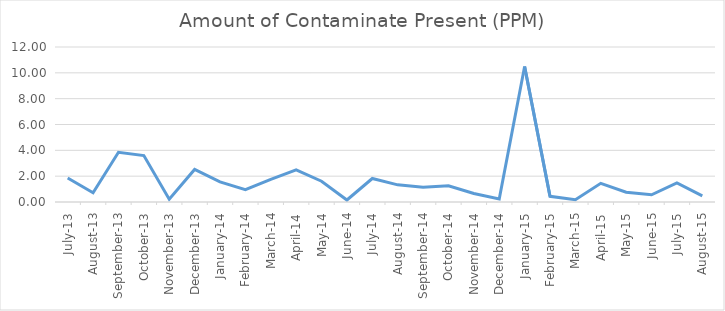
| Category | Amount of Contaminate Present (PPM) |
|---|---|
| 2013-07-01 | 1.863 |
| 2013-08-01 | 0.718 |
| 2013-09-01 | 3.85 |
| 2013-10-01 | 3.598 |
| 2013-11-01 | 0.216 |
| 2013-12-01 | 2.518 |
| 2014-01-01 | 1.553 |
| 2014-02-01 | 0.957 |
| 2014-03-01 | 1.755 |
| 2014-04-01 | 2.49 |
| 2014-05-01 | 1.609 |
| 2014-06-01 | 0.156 |
| 2014-07-01 | 1.821 |
| 2014-08-01 | 1.328 |
| 2014-09-01 | 1.147 |
| 2014-10-01 | 1.249 |
| 2014-11-01 | 0.654 |
| 2014-12-01 | 0.23 |
| 2015-01-01 | 10.496 |
| 2015-02-01 | 0.44 |
| 2015-03-01 | 0.18 |
| 2015-04-01 | 1.445 |
| 2015-05-01 | 0.756 |
| 2015-06-01 | 0.558 |
| 2015-07-01 | 1.472 |
| 2015-08-01 | 0.471 |